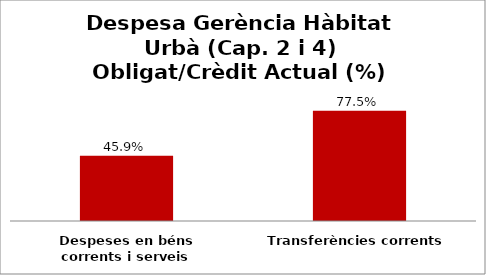
| Category | Series 0 |
|---|---|
| Despeses en béns corrents i serveis | 0.459 |
| Transferències corrents | 0.775 |